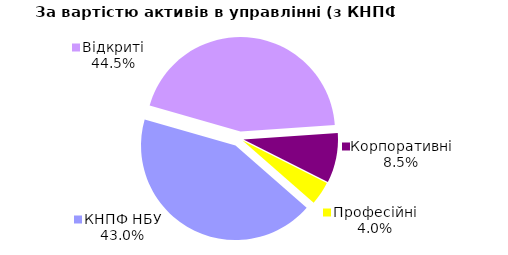
| Category | Series 0 |
|---|---|
| Відкриті | 1838.666 |
| Корпоративні | 352.735 |
| Професійні | 165.197 |
| КНПФ НБУ | 1778.656 |